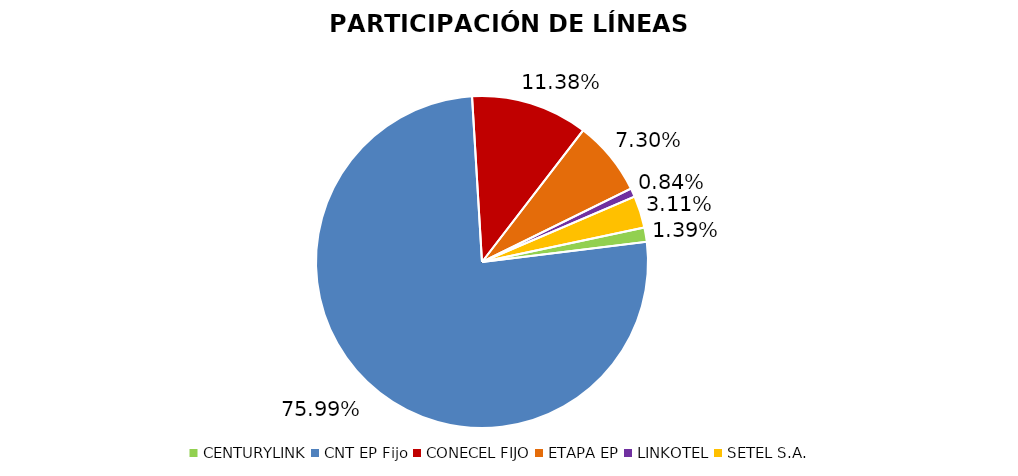
| Category | Participación en el Mercado |
|---|---|
| CENTURYLINK | 0.014 |
| CNT EP Fijo | 0.76 |
| CONECEL FIJO | 0.114 |
| ETAPA EP | 0.073 |
| LINKOTEL | 0.008 |
| SETEL S.A. | 0.031 |